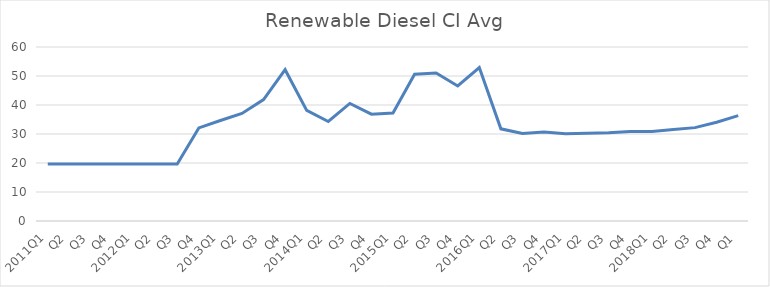
| Category | Series 0 |
|---|---|
| 2011Q1 | 19.65 |
| Q2 | 19.65 |
| Q3 | 19.65 |
| Q4 | 19.65 |
| 2012Q1 | 19.65 |
| Q2 | 19.65 |
| Q3 | 19.65 |
| Q4 | 32.11 |
| 2013Q1 | 34.65 |
| Q2 | 37.1 |
| Q3 | 41.86 |
| Q4 | 52.18 |
| 2014Q1 | 38.16 |
| Q2 | 34.32 |
| Q3 | 40.53 |
| Q4 | 36.84 |
| 2015Q1 | 37.26 |
| Q2 | 50.63 |
| Q3 | 51.06 |
| Q4 | 46.56 |
| 2016Q1 | 52.89 |
| Q2 | 31.78 |
| Q3 | 30.2 |
| Q4 | 30.71 |
| 2017Q1 | 30.11 |
| Q2 | 30.23 |
| Q3 | 30.39 |
| Q4 | 30.9 |
| 2018Q1 | 30.9 |
| Q2 | 31.53 |
| Q3 | 32.2 |
| Q4 | 34.05 |
| Q1 | 36.32 |